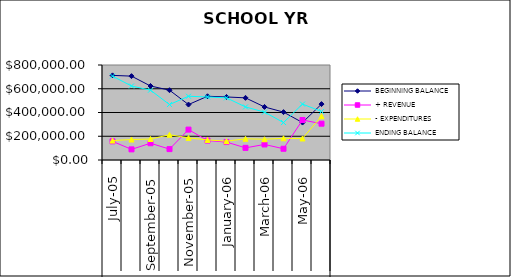
| Category | BEGINNING BALANCE | + REVENUE | - EXPENDITURES | ENDING BALANCE |
|---|---|---|---|---|
| 0 | 712710.55 | 157137.67 | 163659.91 | 706188.31 |
| 1 | 706188.31 | 89507.36 | 172460.23 | 623235.44 |
| 2 | 623235.44 | 141069.91 | 176486.96 | 587818.39 |
| 3 | 587818.39 | 91634.65 | 212524.04 | 466929 |
| 4 | 466929 | 255931.55 | 186122.5 | 536738.05 |
| 5 | 536738.05 | 163429.27 | 169304.24 | 530863.08 |
| 6 | 530863.08 | 150966.3 | 158491.29 | 523338.09 |
| 7 | 523338.09 | 102222.36 | 178795.85 | 446764.6 |
| 8 | 446764.6 | 131033.87 | 174476.86 | 403321.61 |
| 9 | 403321.61 | 94680 | 182644.24 | 315357.37 |
| 10 | 315357.37 | 336838.75 | 181281.04 | 470915.08 |
| 11 | 470915.08 | 305767.73 | 368446.89 | 408235.92 |